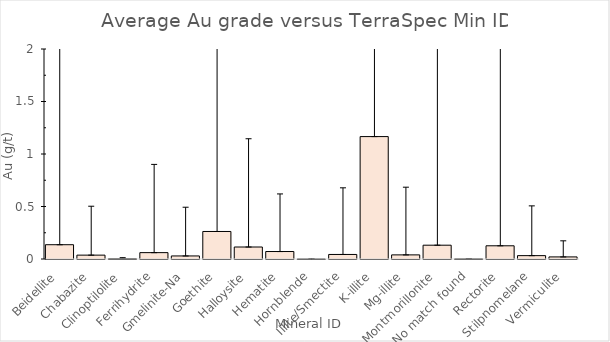
| Category | Average of Au_Best_ppm |
|---|---|
| Beidellite | 0.136 |
| Chabazite | 0.037 |
| Clinoptilolite | 0.003 |
| Ferrihydrite | 0.061 |
| Gmelinite-Na | 0.029 |
| Goethite | 0.262 |
| Halloysite | 0.114 |
| Hematite | 0.071 |
| Hornblende | 0 |
| Illite/Smectite | 0.043 |
| K-illite | 1.166 |
| Mg-illite | 0.039 |
| Montmorillonite | 0.132 |
| No match found | 0.001 |
| Rectorite | 0.126 |
| Stilpnomelane | 0.032 |
| Vermiculite | 0.02 |